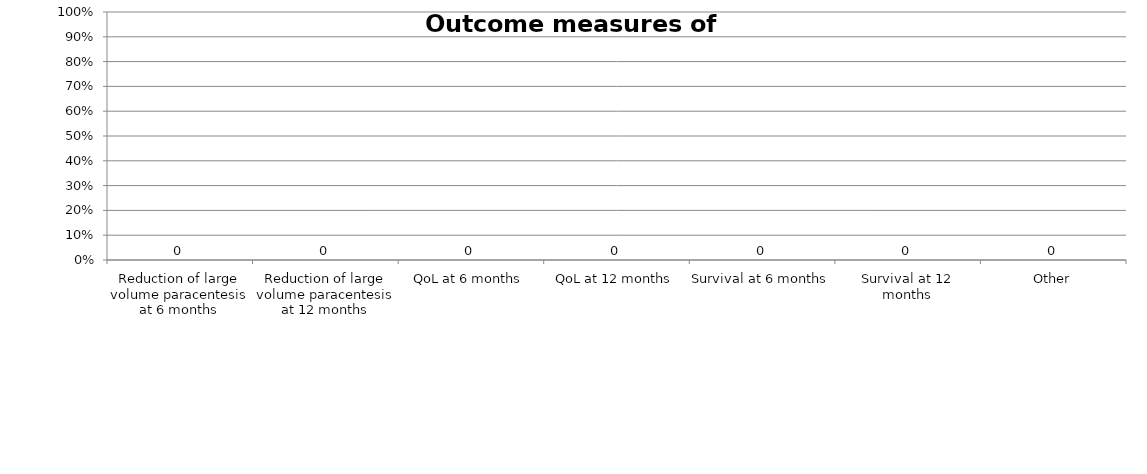
| Category | Series 0 |
|---|---|
| Reduction of large volume paracentesis at 6 months | 0 |
| Reduction of large volume paracentesis at 12 months | 0 |
| QoL at 6 months | 0 |
| QoL at 12 months | 0 |
| Survival at 6 months | 0 |
| Survival at 12 months | 0 |
| Other | 0 |